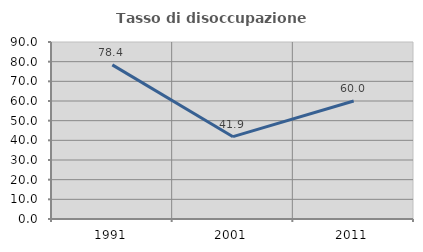
| Category | Tasso di disoccupazione giovanile  |
|---|---|
| 1991.0 | 78.378 |
| 2001.0 | 41.86 |
| 2011.0 | 60 |